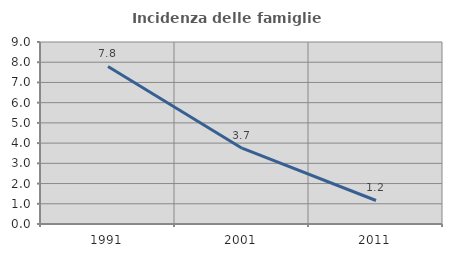
| Category | Incidenza delle famiglie numerose |
|---|---|
| 1991.0 | 7.792 |
| 2001.0 | 3.748 |
| 2011.0 | 1.163 |